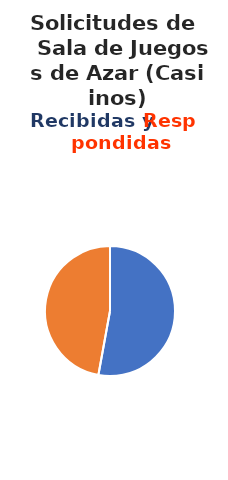
| Category | Series 0 |
|---|---|
| 0 | 37 |
| 1 | 33 |